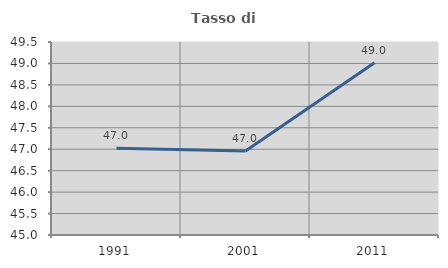
| Category | Tasso di occupazione   |
|---|---|
| 1991.0 | 47.021 |
| 2001.0 | 46.961 |
| 2011.0 | 49.018 |